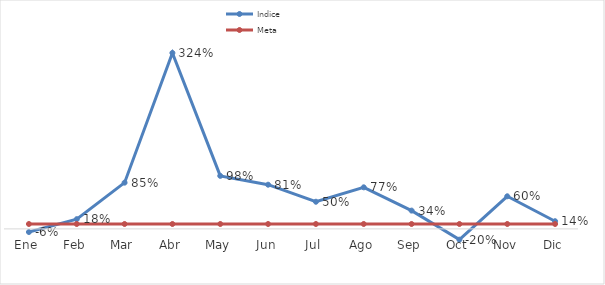
| Category | Indice | Meta |
|---|---|---|
| Ene | -0.058 | 0.09 |
| Feb | 0.179 | 0.09 |
| Mar | 0.852 | 0.09 |
| Abr | 3.243 | 0.09 |
| May | 0.977 | 0.09 |
| Jun | 0.814 | 0.09 |
| Jul | 0.5 | 0.09 |
| Ago | 0.766 | 0.09 |
| Sep | 0.337 | 0.09 |
| Oct | -0.199 | 0.09 |
| Nov | 0.601 | 0.09 |
| Dic | 0.141 | 0.09 |